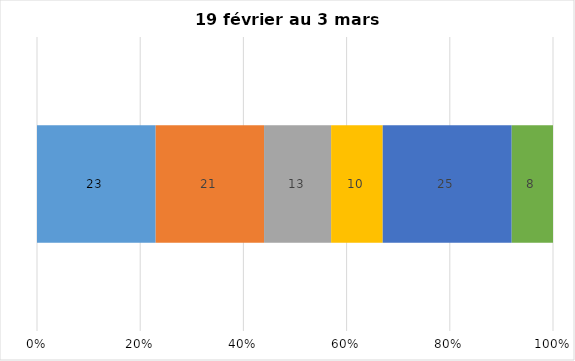
| Category | Plusieurs fois par jour | Une fois par jour | Quelques fois par semaine   | Une fois par semaine ou moins   |  Jamais   |  Je n’utilise pas les médias sociaux |
|---|---|---|---|---|---|---|
| 0 | 23 | 21 | 13 | 10 | 25 | 8 |